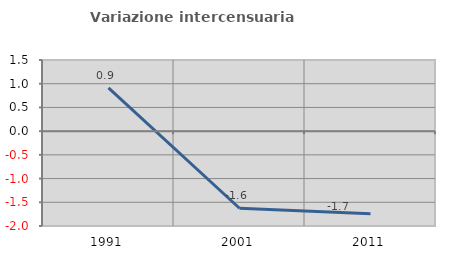
| Category | Variazione intercensuaria annua |
|---|---|
| 1991.0 | 0.914 |
| 2001.0 | -1.626 |
| 2011.0 | -1.744 |